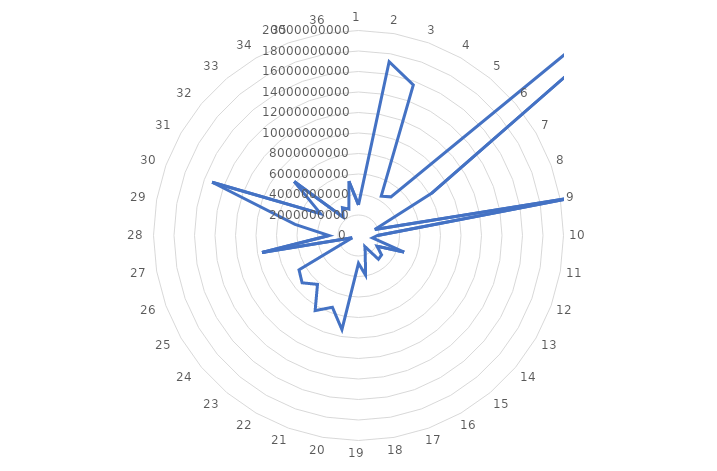
| Category | Exosomal count (particles/ml) |
|---|---|
| 1.0 | 2984368000 |
| 2.0 | 17211580000 |
| 3.0 | 15634453000 |
| 4.0 | 4433922000 |
| 5.0 | 4921309000 |
| 6.0 | 79954140000 |
| 7.0 | 8229062000 |
| 8.0 | 1688374000 |
| 9.0 | 22119100000 |
| 10.0 | 1856610000 |
| 11.0 | 1386118000 |
| 12.0 | 4737135000 |
| 13.0 | 2087862000 |
| 14.0 | 2939072000 |
| 15.0 | 3022993000 |
| 16.0 | 1239914000 |
| 17.0 | 1947092000 |
| 18.0 | 3911042000 |
| 19.0 | 2707470000 |
| 20.0 | 9316580000 |
| 21.0 | 7450460000 |
| 22.0 | 8460266000 |
| 23.0 | 6223156000 |
| 24.0 | 7180810000 |
| 25.0 | 6699770000 |
| 26.0 | 650165000 |
| 27.0 | 9555000000 |
| 28.0 | 2869280000 |
| 29.0 | 6285720000 |
| 30.0 | 15199100000 |
| 31.0 | 4272230000 |
| 32.0 | 8193660000 |
| 33.0 | 2325660000 |
| 34.0 | 3137556000 |
| 35.0 | 2741350000 |
| 36.0 | 5378653000 |